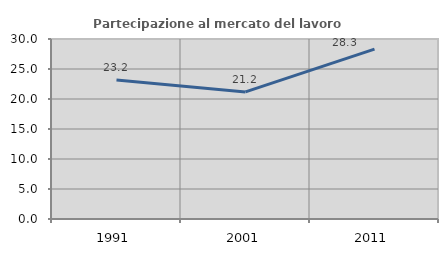
| Category | Partecipazione al mercato del lavoro  femminile |
|---|---|
| 1991.0 | 23.18 |
| 2001.0 | 21.18 |
| 2011.0 | 28.324 |